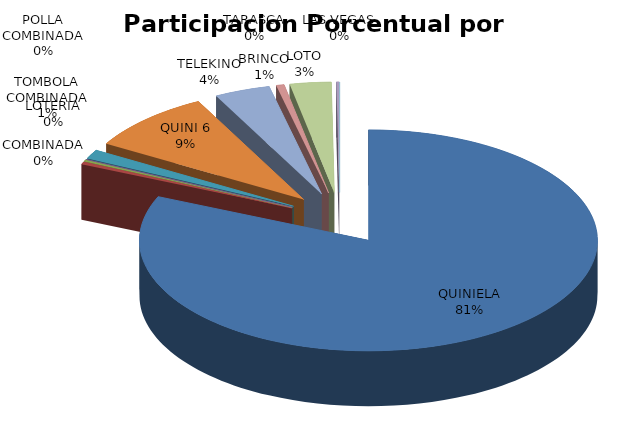
| Category | Series 0 |
|---|---|
| QUINIELA | 24118131.15 |
| COMBINADA | 105858 |
| LOTERIA | 79713 |
| POLLA COMBINADA | 8884.8 |
| TOMBOLA COMBINADA | 392778 |
| QUINI 6 | 2644592 |
| TELEKINO | 1164207 |
| BRINCO | 165628.8 |
| LOTO | 861186.15 |
| TARASCA | 61901.25 |
| LAS VEGAS | 0 |